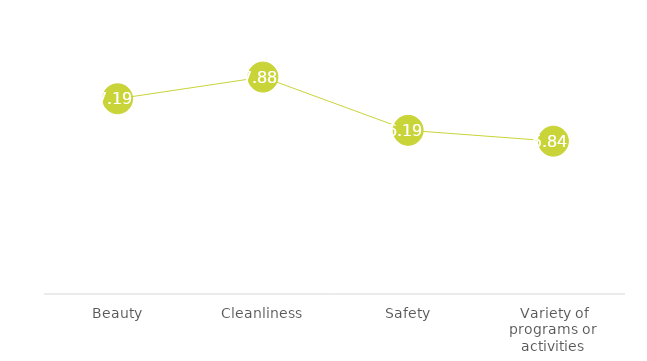
| Category | Total |
|---|---|
|  Beauty | 7.188 |
|  Cleanliness | 7.875 |
|  Safety | 6.188 |
|  Variety of programs or activities | 5.844 |